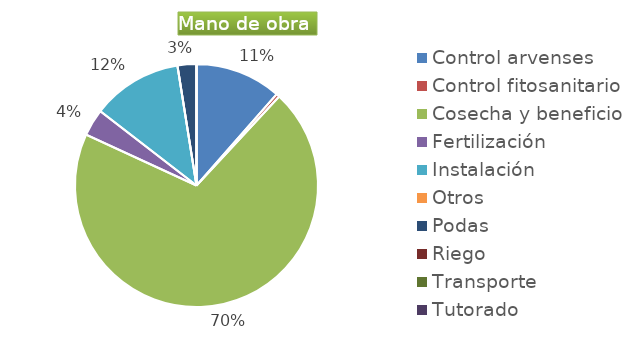
| Category | Series 0 |
|---|---|
| Control arvenses | 4719104 |
| Control fitosanitario | 179776 |
| Cosecha y beneficio | 28781817 |
| Fertilización | 1483152 |
| Instalación | 4943840 |
| Otros | 0 |
| Podas | 1033712 |
| Riego | 0 |
| Transporte | 0 |
| Tutorado | 0 |